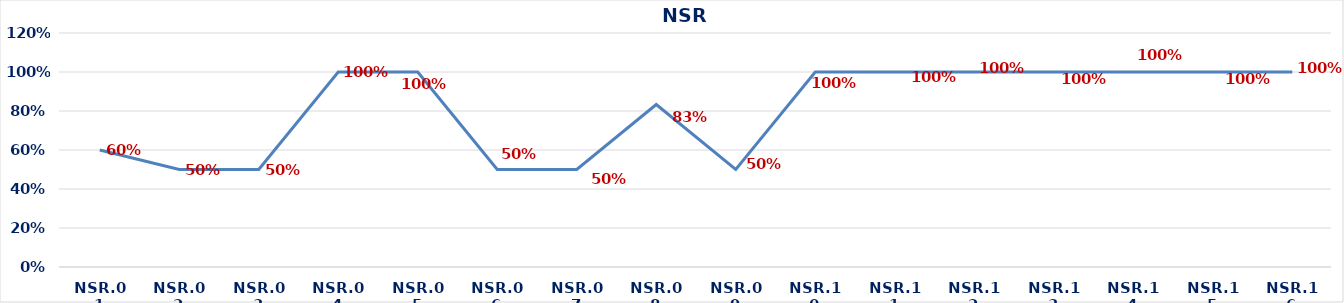
| Category | Series 0 |
|---|---|
| NSR.01 | 0.6 |
| NSR.02 | 0.5 |
| NSR.03 | 0.5 |
| NSR.04 | 1 |
| NSR.05 | 1 |
| NSR.06 | 0.5 |
| NSR.07 | 0.5 |
| NSR.08 | 0.833 |
| NSR.09 | 0.5 |
| NSR.10 | 1 |
| NSR.11 | 1 |
| NSR.12 | 1 |
| NSR.13 | 1 |
| NSR.14 | 1 |
| NSR.15 | 1 |
| NSR.16 | 1 |